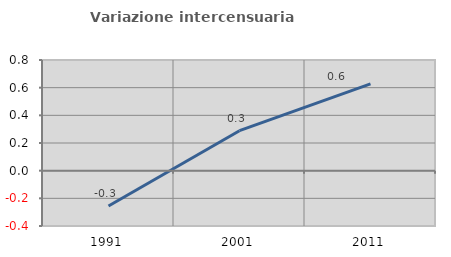
| Category | Variazione intercensuaria annua |
|---|---|
| 1991.0 | -0.255 |
| 2001.0 | 0.289 |
| 2011.0 | 0.627 |